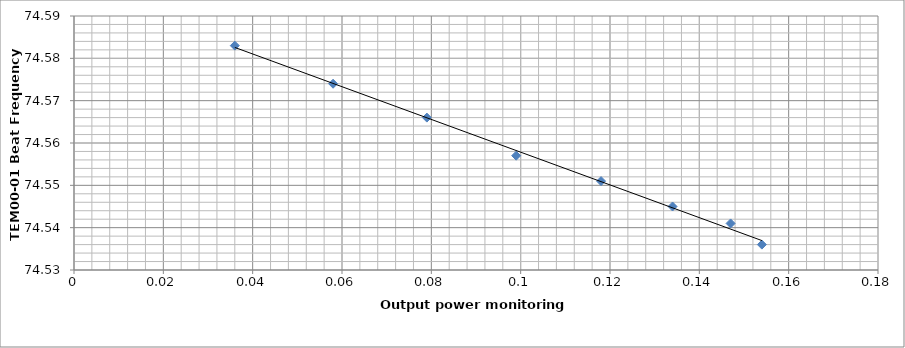
| Category | Series 0 |
|---|---|
| 0.154 | 74.536 |
| 0.147 | 74.541 |
| 0.134 | 74.545 |
| 0.118 | 74.551 |
| 0.099 | 74.557 |
| 0.079 | 74.566 |
| 0.058 | 74.574 |
| 0.036 | 74.583 |